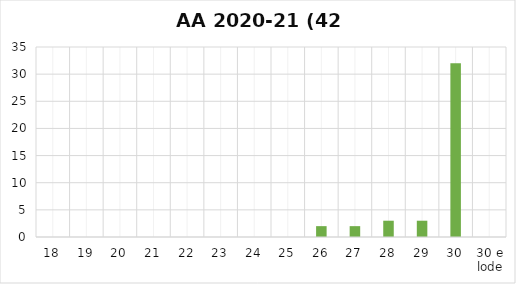
| Category | Series 0 |
|---|---|
| 18 | 0 |
| 19 | 0 |
| 20 | 0 |
| 21 | 0 |
| 22 | 0 |
| 23 | 0 |
| 24 | 0 |
| 25 | 0 |
| 26 | 2 |
| 27 | 2 |
| 28 | 3 |
| 29 | 3 |
| 30 | 32 |
| 30 e lode | 0 |